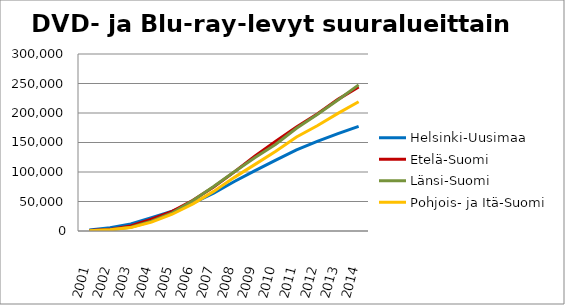
| Category | Helsinki-Uusimaa | Etelä-Suomi | Länsi-Suomi | Pohjois- ja Itä-Suomi |
|---|---|---|---|---|
| 2001.0 | 1687 | 914 | 506 | 542 |
| 2002.0 | 5699 | 2770 | 2169 | 2055 |
| 2003.0 | 11955 | 8609 | 6349 | 5751 |
| 2004.0 | 22781 | 20160 | 16505 | 14955 |
| 2005.0 | 33476 | 33276 | 30764 | 28409 |
| 2006.0 | 47299 | 51983 | 51649 | 46062 |
| 2007.0 | 64314 | 74599 | 75331 | 67132 |
| 2008.0 | 83959 | 100190 | 100405 | 90906 |
| 2009.0 | 102279 | 127004 | 124616 | 112925 |
| 2010.0 | 120181 | 152145 | 146959 | 135210 |
| 2011.0 | 137315 | 176228 | 174131 | 159270 |
| 2012.0 | 151776 | 198436 | 197554 | 178358 |
| 2013.0 | 164915 | 223113 | 222173 | 199315 |
| 2014.0 | 177246 | 244199 | 247708 | 218963 |